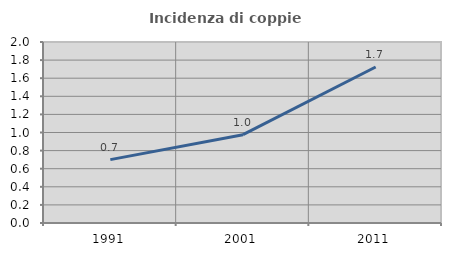
| Category | Incidenza di coppie miste |
|---|---|
| 1991.0 | 0.701 |
| 2001.0 | 0.976 |
| 2011.0 | 1.724 |